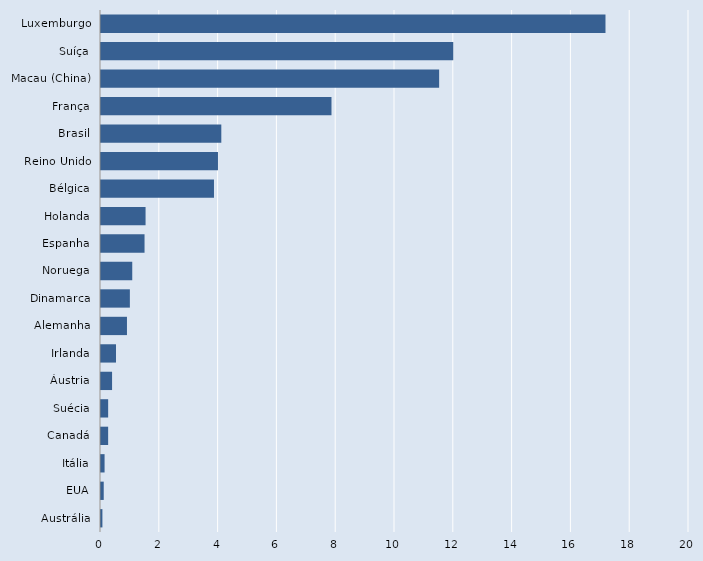
| Category | Series 0 |
|---|---|
| Austrália | 0.048 |
| EUA | 0.093 |
| Itália | 0.122 |
| Canadá | 0.243 |
| Suécia | 0.243 |
| Áustria | 0.377 |
| Irlanda | 0.509 |
| Alemanha | 0.883 |
| Dinamarca | 0.982 |
| Noruega | 1.063 |
| Espanha | 1.481 |
| Holanda | 1.516 |
| Bélgica | 3.843 |
| Reino Unido | 3.979 |
| Brasil | 4.092 |
| França | 7.84 |
| Macau (China) | 11.501 |
| Suíça | 11.982 |
| Luxemburgo | 17.159 |